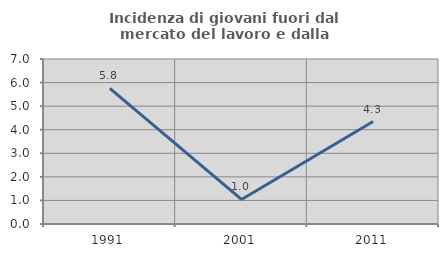
| Category | Incidenza di giovani fuori dal mercato del lavoro e dalla formazione  |
|---|---|
| 1991.0 | 5.755 |
| 2001.0 | 1.042 |
| 2011.0 | 4.348 |